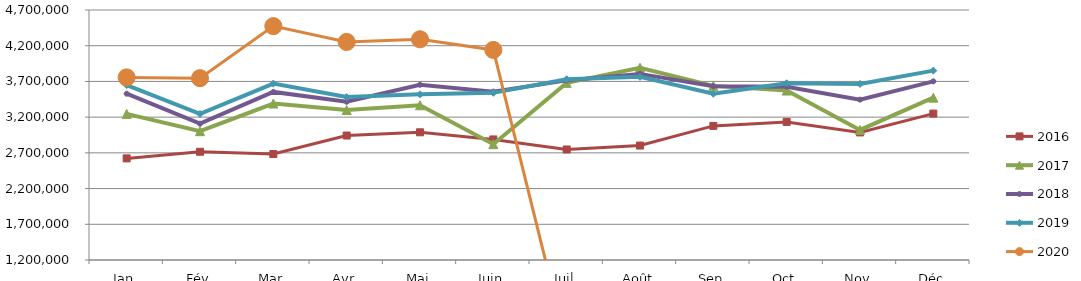
| Category | 2015 | 2016 | 2017 | 2018 | 2019 | 2020 |
|---|---|---|---|---|---|---|
| Jan |  | 2622357.223 | 3245197.198 | 3528241.229 | 3649683.28 | 3756283.089 |
| Fév |  | 2715310.977 | 3003729.629 | 3108555.552 | 3245578.859 | 3745626.569 |
| Mar |  | 2683334.081 | 3390554.233 | 3553184.371 | 3669368.201 | 4474226.706 |
| Avr |  | 2942696.513 | 3299613.683 | 3414889.226 | 3480737.518 | 4252877.011 |
| Mai |  | 2987632.117 | 3365963.719 | 3653293.789 | 3520173.393 | 4289935.067 |
| Juin |  | 2887718.315 | 2821580.781 | 3557351.211 | 3540194.304 | 4141054.684 |
| Juil |  | 2747166.698 | 3679918.411 | 3714873.235 | 3730287.221 | 0 |
| Août |  | 2802126.518 | 3891741.582 | 3805404.89 | 3764065.715 | 0 |
| Sep |  | 3077154.853 | 3637785.062 | 3633589.924 | 3528193.213 | 0 |
| Oct |  | 3132986.26 | 3572314.256 | 3626810.501 | 3674095.651 | 0 |
| Nov |  | 2985784.845 | 3021243.296 | 3445044.438 | 3664597.161 | 0 |
| Déc |  | 3249878.984 | 3473156.754 | 3701418.855 | 3851208.606 | 0 |